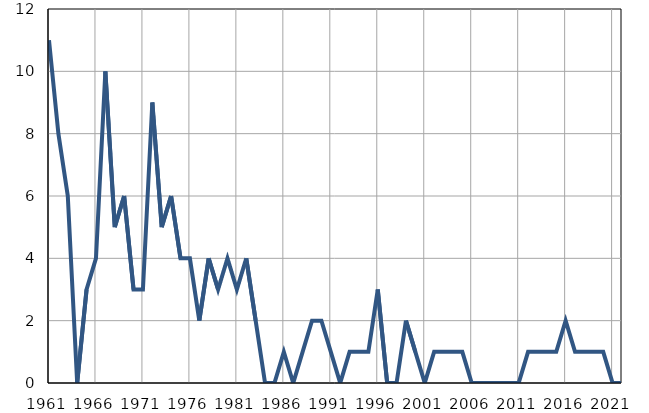
| Category | Умрла 
одојчад |
|---|---|
| 1961.0 | 11 |
| 1962.0 | 8 |
| 1963.0 | 6 |
| 1964.0 | 0 |
| 1965.0 | 3 |
| 1966.0 | 4 |
| 1967.0 | 10 |
| 1968.0 | 5 |
| 1969.0 | 6 |
| 1970.0 | 3 |
| 1971.0 | 3 |
| 1972.0 | 9 |
| 1973.0 | 5 |
| 1974.0 | 6 |
| 1975.0 | 4 |
| 1976.0 | 4 |
| 1977.0 | 2 |
| 1978.0 | 4 |
| 1979.0 | 3 |
| 1980.0 | 4 |
| 1981.0 | 3 |
| 1982.0 | 4 |
| 1983.0 | 2 |
| 1984.0 | 0 |
| 1985.0 | 0 |
| 1986.0 | 1 |
| 1987.0 | 0 |
| 1988.0 | 1 |
| 1989.0 | 2 |
| 1990.0 | 2 |
| 1991.0 | 1 |
| 1992.0 | 0 |
| 1993.0 | 1 |
| 1994.0 | 1 |
| 1995.0 | 1 |
| 1996.0 | 3 |
| 1997.0 | 0 |
| 1998.0 | 0 |
| 1999.0 | 2 |
| 2000.0 | 1 |
| 2001.0 | 0 |
| 2002.0 | 1 |
| 2003.0 | 1 |
| 2004.0 | 1 |
| 2005.0 | 1 |
| 2006.0 | 0 |
| 2007.0 | 0 |
| 2008.0 | 0 |
| 2009.0 | 0 |
| 2010.0 | 0 |
| 2011.0 | 0 |
| 2012.0 | 1 |
| 2013.0 | 1 |
| 2014.0 | 1 |
| 2015.0 | 1 |
| 2016.0 | 2 |
| 2017.0 | 1 |
| 2018.0 | 1 |
| 2019.0 | 1 |
| 2020.0 | 1 |
| 2021.0 | 0 |
| 2022.0 | 0 |